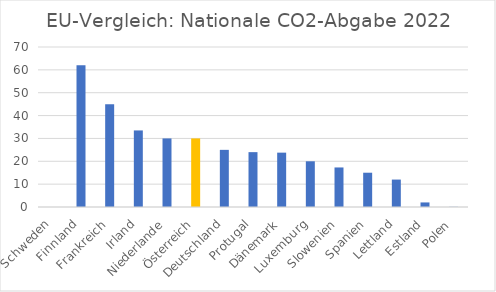
| Category | Series 0 |
|---|---|
| Schweden | 0 |
| Finnland | 62 |
| Frankreich | 45 |
| Irland | 33.5 |
| Niederlande | 30 |
| Österreich | 30 |
| Deutschland | 25 |
| Protugal | 24 |
| Dänemark | 23.78 |
| Luxemburg | 20 |
| Slowenien | 17.3 |
| Spanien | 15 |
| Lettland | 12 |
| Estland | 2 |
| Polen | 0.07 |